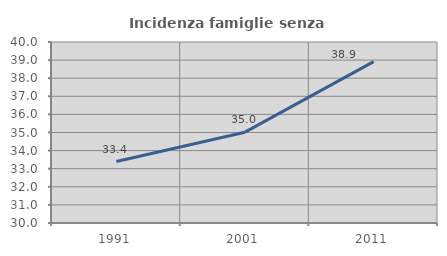
| Category | Incidenza famiglie senza nuclei |
|---|---|
| 1991.0 | 33.395 |
| 2001.0 | 35.018 |
| 2011.0 | 38.918 |